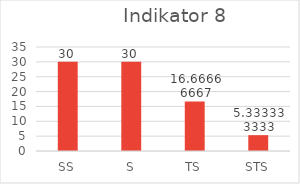
| Category | Series 0 |
|---|---|
| 0 | 30 |
| 1 | 30 |
| 2 | 16.667 |
| 3 | 5.333 |